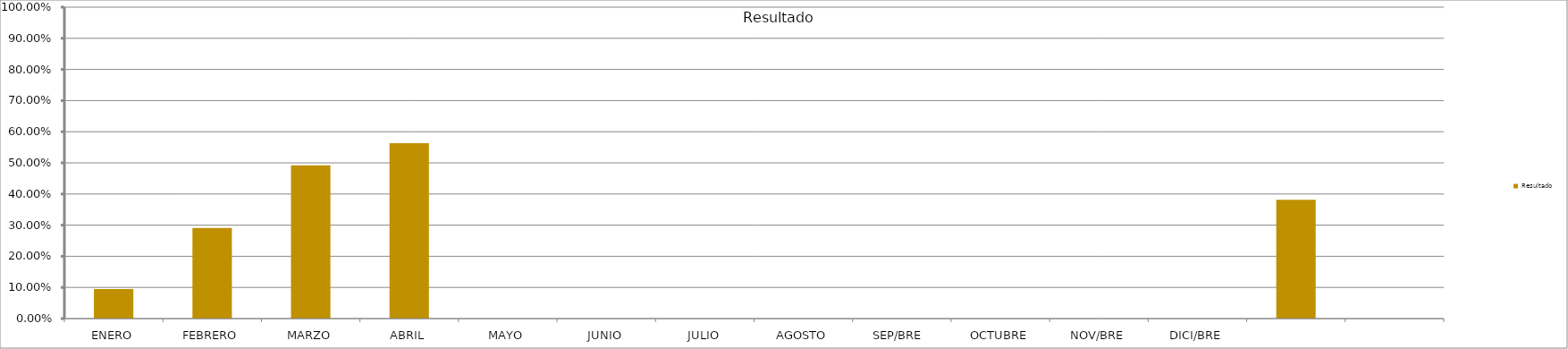
| Category | Resultado  |
|---|---|
| ENERO | 0.095 |
| FEBRERO | 0.291 |
| MARZO | 0.492 |
| ABRIL | 0.564 |
| MAYO | 0 |
| JUNIO | 0 |
| JULIO | 0 |
| AGOSTO | 0 |
| SEP/BRE  | 0 |
| OCTUBRE | 0 |
| NOV/BRE | 0 |
| DICI/BRE | 0 |